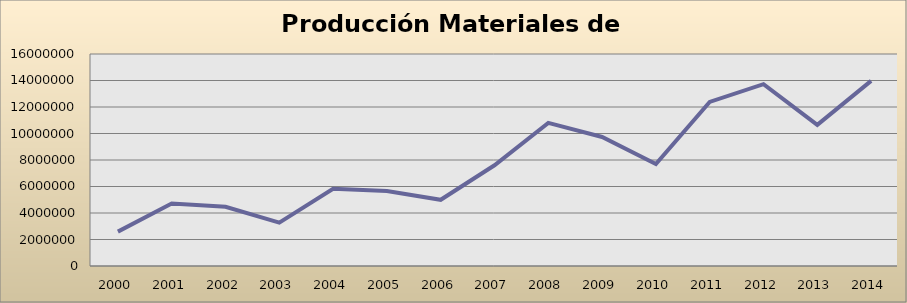
| Category | Series 0 |
|---|---|
| 2000.0 | 2595542.15 |
| 2001.0 | 4722522.47 |
| 2002.0 | 4466904.89 |
| 2003.0 | 3271970.34 |
| 2004.0 | 5833890.05 |
| 2005.0 | 5661854.59 |
| 2006.0 | 4997466.97 |
| 2007.0 | 7601612.4 |
| 2008.0 | 10805514.53 |
| 2009.0 | 9735721.15 |
| 2010.0 | 7700338.91 |
| 2011.0 | 12385717.31 |
| 2012.0 | 13725747.163 |
| 2013.0 | 10653047.66 |
| 2014.0 | 13971075.87 |